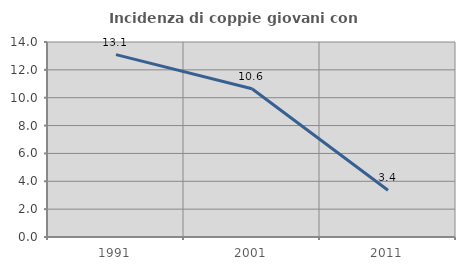
| Category | Incidenza di coppie giovani con figli |
|---|---|
| 1991.0 | 13.093 |
| 2001.0 | 10.644 |
| 2011.0 | 3.356 |